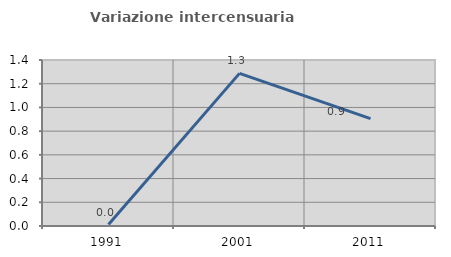
| Category | Variazione intercensuaria annua |
|---|---|
| 1991.0 | 0.012 |
| 2001.0 | 1.287 |
| 2011.0 | 0.905 |